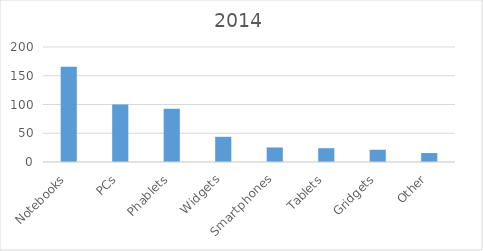
| Category | 2014 |
|---|---|
| Notebooks | 165.82 |
| PCs | 100 |
| Phablets | 92.577 |
| Widgets | 43.797 |
| Smartphones | 25.288 |
| Tablets | 24.01 |
| Gridgets | 21.322 |
| Other | 15.542 |